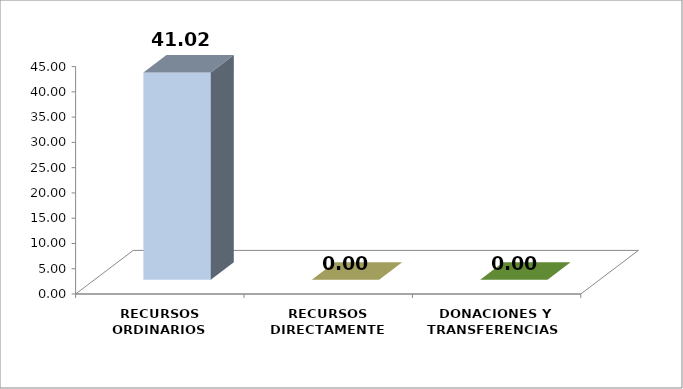
| Category | 1er Trimestre |
|---|---|
| RECURSOS ORDINARIOS | 41.016 |
| RECURSOS DIRECTAMENTE RECAUDADOS  | 0 |
| DONACIONES Y TRANSFERENCIAS  | 0 |